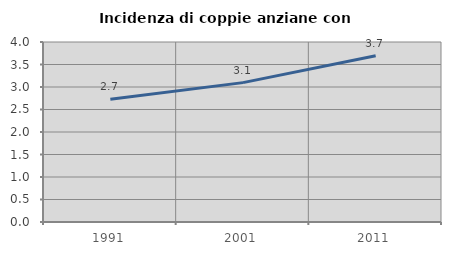
| Category | Incidenza di coppie anziane con figli |
|---|---|
| 1991.0 | 2.725 |
| 2001.0 | 3.097 |
| 2011.0 | 3.696 |